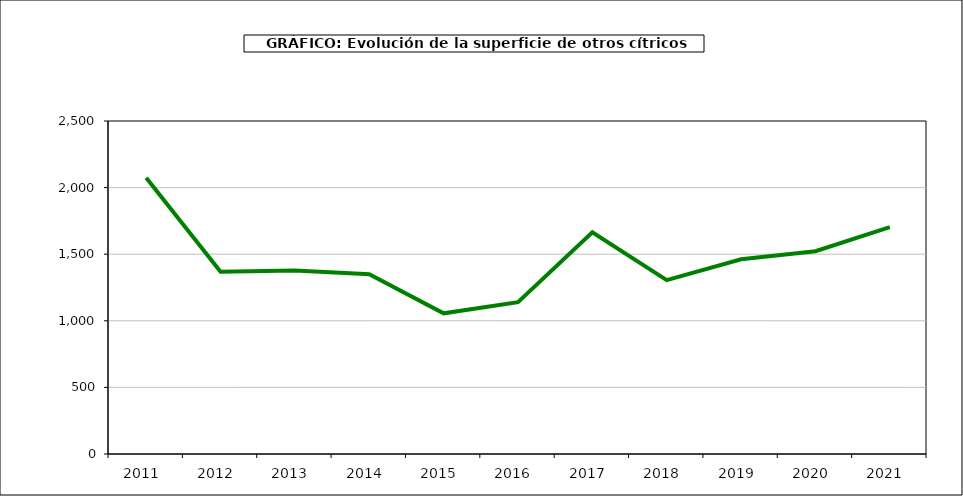
| Category | superficie |
|---|---|
| 2011.0 | 2074 |
| 2012.0 | 1368 |
| 2013.0 | 1377 |
| 2014.0 | 1349 |
| 2015.0 | 1056 |
| 2016.0 | 1140 |
| 2017.0 | 1665 |
| 2018.0 | 1305 |
| 2019.0 | 1462 |
| 2020.0 | 1522 |
| 2021.0 | 1704 |